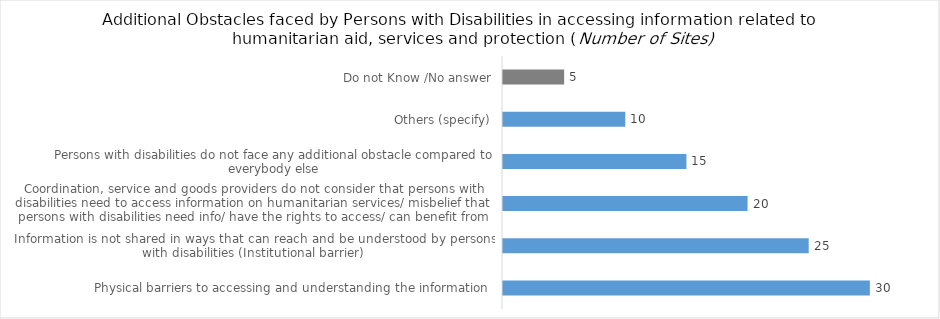
| Category | Additional Obstacles faced by Persons with Disabilities in accessing information related to humanitarian aid, services and protection |
|---|---|
| Physical barriers to accessing and understanding the information  | 30 |
| Information is not shared in ways that can reach and be understood by persons with disabilities (Institutional barrier) | 25 |
| Coordination, service and goods providers do not consider that persons with disabilities need to access information on humanitarian services/ misbelief that persons with disabilities need info/ have the rights to access/ can benefit from same info as every | 20 |
| Persons with disabilities do not face any additional obstacle compared to everybody else | 15 |
| Others (specify) | 10 |
| Do not Know /No answer | 5 |